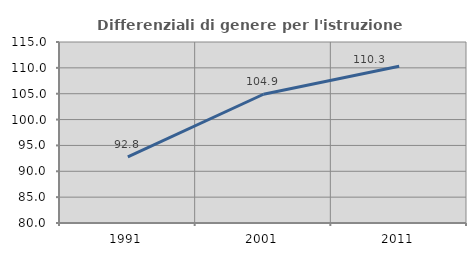
| Category | Differenziali di genere per l'istruzione superiore |
|---|---|
| 1991.0 | 92.785 |
| 2001.0 | 104.898 |
| 2011.0 | 110.308 |